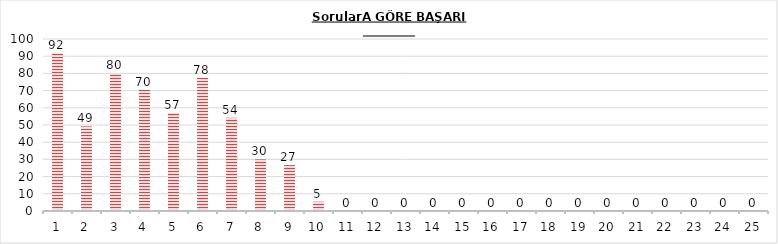
| Category | Series 0 |
|---|---|
| 0 | 91.667 |
| 1 | 49.167 |
| 2 | 80 |
| 3 | 70.417 |
| 4 | 57.083 |
| 5 | 77.5 |
| 6 | 54.167 |
| 7 | 30 |
| 8 | 26.667 |
| 9 | 5.417 |
| 10 | 0 |
| 11 | 0 |
| 12 | 0 |
| 13 | 0 |
| 14 | 0 |
| 15 | 0 |
| 16 | 0 |
| 17 | 0 |
| 18 | 0 |
| 19 | 0 |
| 20 | 0 |
| 21 | 0 |
| 22 | 0 |
| 23 | 0 |
| 24 | 0 |